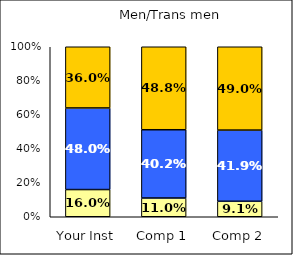
| Category | Low Civic Minded Values | Average Civic Minded Values | High Civic Minded Values |
|---|---|---|---|
| Your Inst | 0.16 | 0.48 | 0.36 |
| Comp 1 | 0.11 | 0.402 | 0.488 |
| Comp 2 | 0.091 | 0.419 | 0.49 |